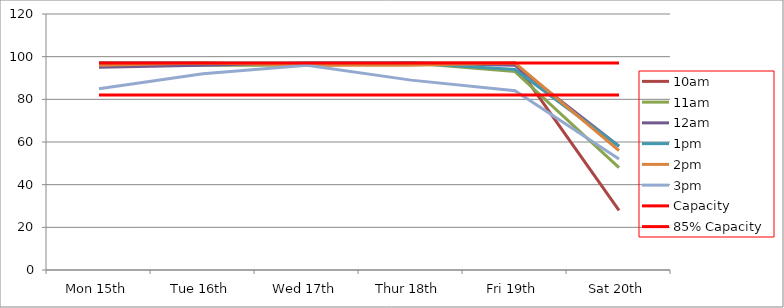
| Category | 9am | 10am | 11am | 12am | 1pm | 2pm | 3pm | 4pm | 5pm | Capacity | 85% Capacity |
|---|---|---|---|---|---|---|---|---|---|---|---|
| Mon 15th |  | 97 | 97 | 95 | 97 | 96 | 85 |  |  | 97 | 82 |
| Tue 16th |  | 97 | 96 | 96 | 97 | 97 | 92 |  |  | 97 | 82 |
| Wed 17th |  | 96 | 96 | 97 | 97 | 96 | 96 |  |  | 97 | 82 |
| Thur 18th |  | 97 | 97 | 97 | 97 | 96 | 89 |  |  | 97 | 82 |
| Fri 19th |  | 97 | 93 | 96 | 94 | 97 | 84 |  |  | 97 | 82 |
| Sat 20th |  | 28 | 48 | 58 | 58 | 56 | 52 |  |  | 97 | 82 |